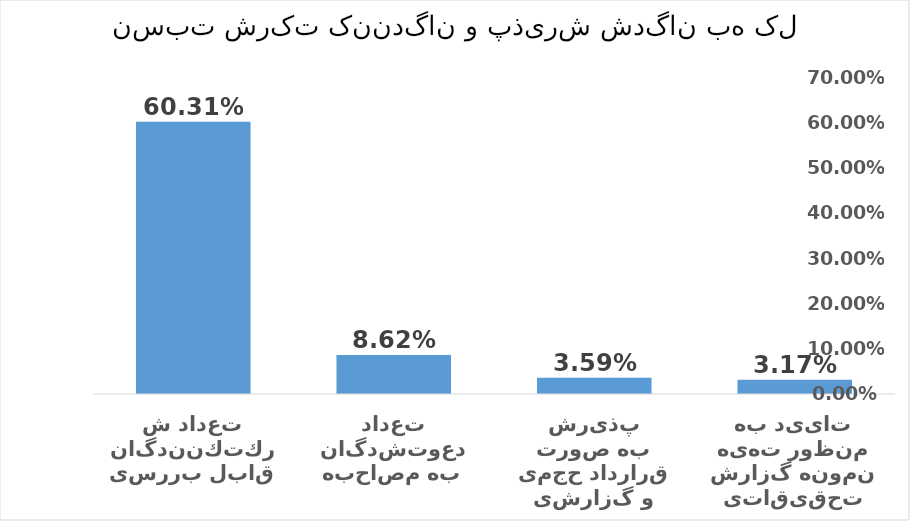
| Category | Series 0 |
|---|---|
| تایید به منظور تهیه نمونه گزارش تحقیقاتی | 0.032 |
| پذیرش به صورت قرارداد حجمی و گزارشی | 0.036 |
| تعداد دعوت‌شدگان به مصاحبه | 0.086 |
| تعداد شركت‌كنندگان قابل بررسی | 0.603 |